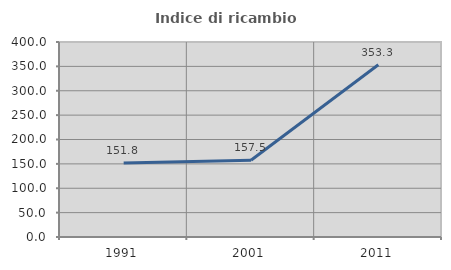
| Category | Indice di ricambio occupazionale  |
|---|---|
| 1991.0 | 151.818 |
| 2001.0 | 157.547 |
| 2011.0 | 353.333 |